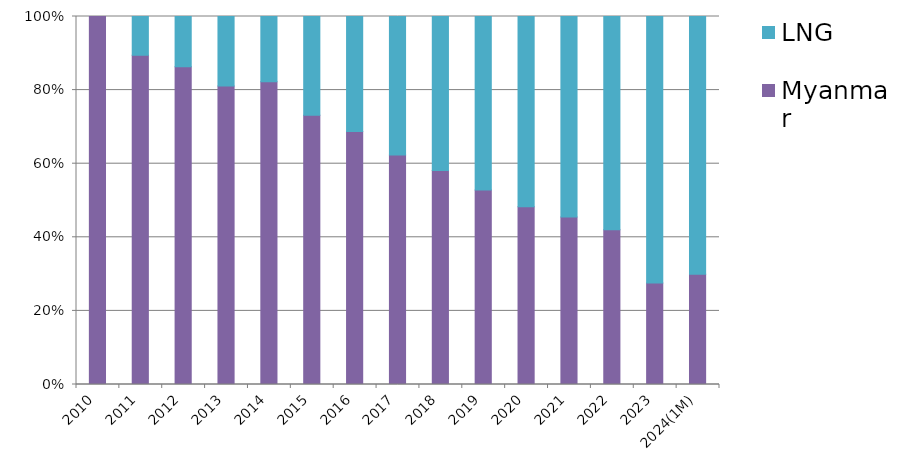
| Category | Myanmar | LNG |
|---|---|---|
| 2010 | 100 | 0 |
| 2011 | 89.465 | 10.535 |
| 2012 | 86.365 | 13.635 |
| 2013 | 81.142 | 18.858 |
| 2014 | 82.263 | 17.737 |
| 2015 | 73.157 | 26.843 |
| 2016 | 68.738 | 31.262 |
| 2017 | 62.374 | 37.626 |
| 2018 | 58.148 | 41.852 |
| 2019 | 52.863 | 47.137 |
| 2020 | 48.305 | 51.695 |
| 2021 | 45.519 | 54.481 |
| 2022 | 42.082 | 57.918 |
| 2023 | 27.615 | 72.385 |
| 2024(1M) | 29.983 | 70.017 |